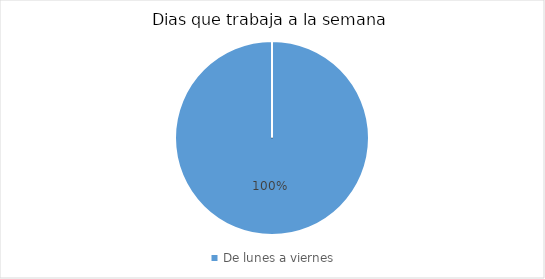
| Category | De lunes a viernes |
|---|---|
| De lunes a viernes | 7 |